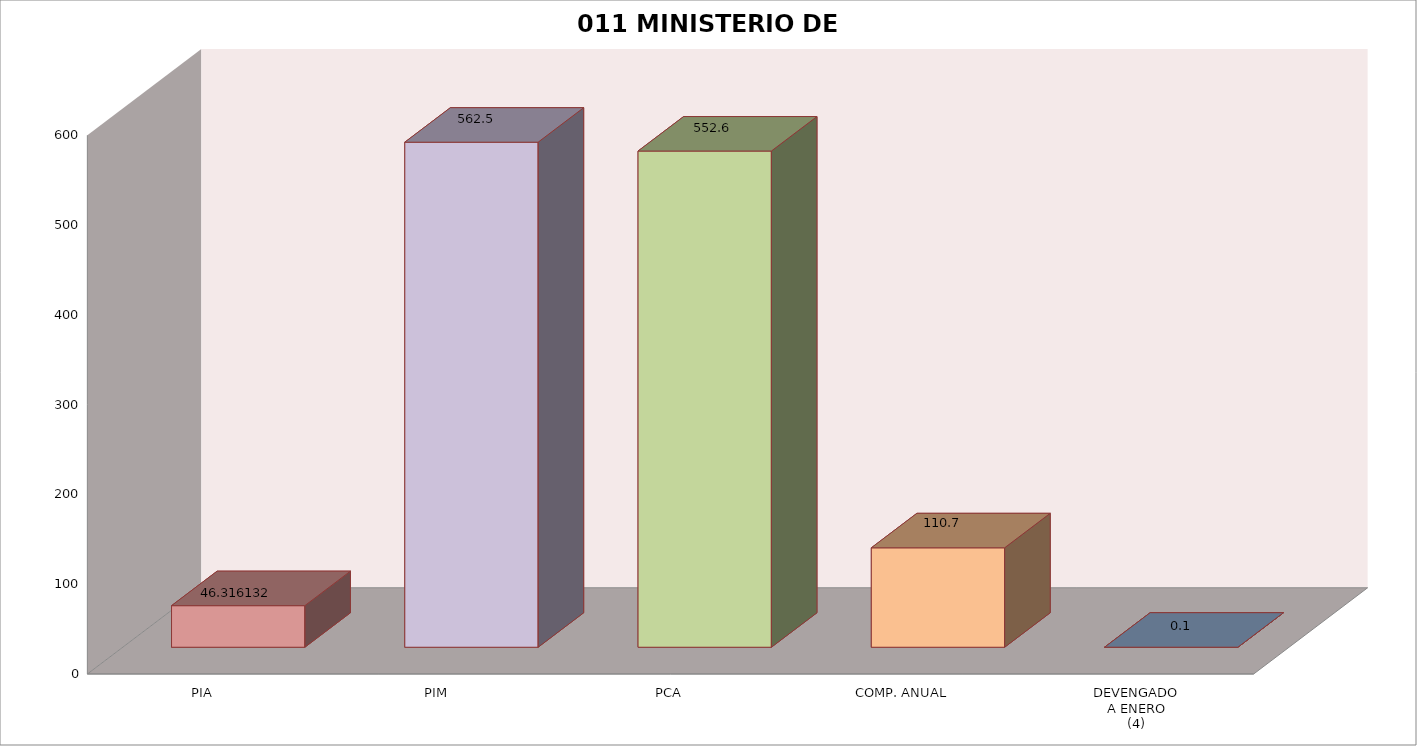
| Category | 011 MINISTERIO DE SALUD |
|---|---|
| PIA | 46.316 |
| PIM | 562.466 |
| PCA | 552.617 |
| COMP. ANUAL | 110.746 |
| DEVENGADO
A ENERO
(4) | 0.064 |